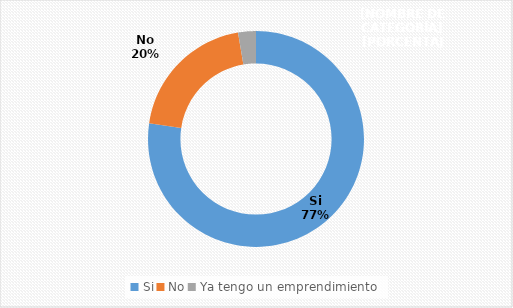
| Category | Series 0 |
|---|---|
| Si | 0.773 |
| No | 0.2 |
| Ya tengo un emprendimiento | 0.027 |